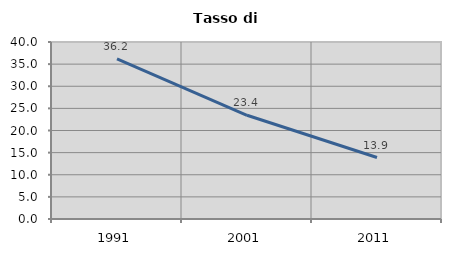
| Category | Tasso di disoccupazione   |
|---|---|
| 1991.0 | 36.204 |
| 2001.0 | 23.438 |
| 2011.0 | 13.896 |